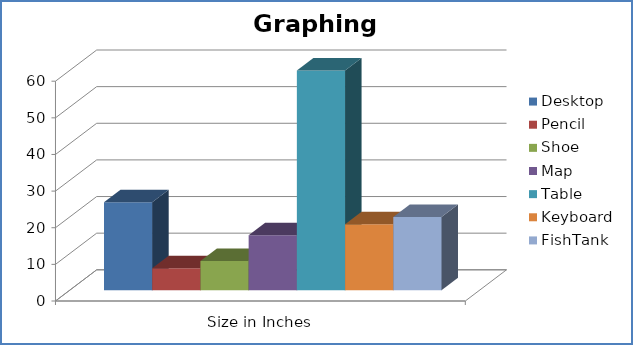
| Category | Desktop | Pencil | Shoe | Map | Table | Keyboard | FishTank |
|---|---|---|---|---|---|---|---|
| Size in Inches | 24 | 6 | 8 | 15 | 60 | 18 | 20 |